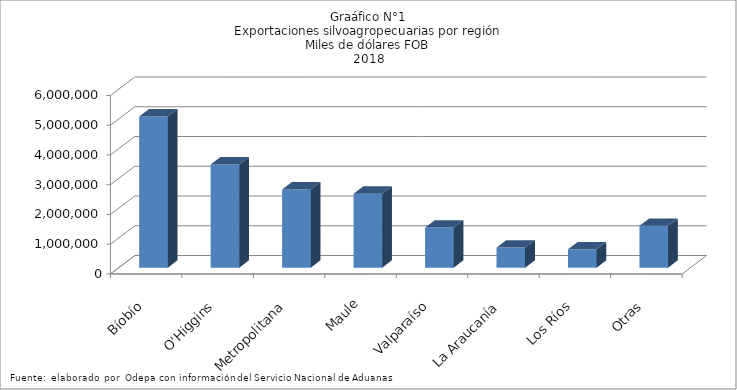
| Category | Series 0 |
|---|---|
| Bíobío | 5084698.866 |
| O'Higgins | 3471969.213 |
| Metropolitana | 2627757.751 |
| Maule | 2485472.186 |
| Valparaíso | 1347415.695 |
| La Araucanía | 676408.418 |
| Los Ríos | 616438.05 |
| Otras | 1407126.084 |